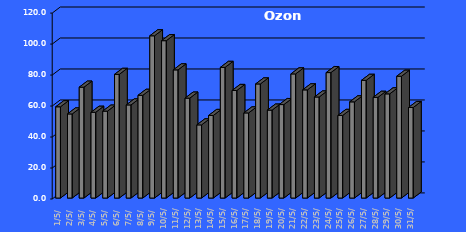
| Category | Ozon  [µg/m3] |
|---|---|
| 2023-05-01 | 58.909 |
| 2023-05-02 | 54.284 |
| 2023-05-03 | 71.57 |
| 2023-05-04 | 55.371 |
| 2023-05-05 | 56.107 |
| 2023-05-06 | 79.833 |
| 2023-05-07 | 60.107 |
| 2023-05-08 | 66.31 |
| 2023-05-09 | 104.729 |
| 2023-05-10 | 101.578 |
| 2023-05-11 | 82.733 |
| 2023-05-12 | 64.502 |
| 2023-05-13 | 47.219 |
| 2023-05-14 | 53.305 |
| 2023-05-15 | 84.342 |
| 2023-05-16 | 69.433 |
| 2023-05-17 | 54.95 |
| 2023-05-18 | 73.649 |
| 2023-05-19 | 56.762 |
| 2023-05-20 | 60.337 |
| 2023-05-21 | 80.129 |
| 2023-05-22 | 69.826 |
| 2023-05-23 | 65.223 |
| 2023-05-24 | 80.973 |
| 2023-05-25 | 53.337 |
| 2023-05-26 | 62.093 |
| 2023-05-27 | 75.981 |
| 2023-05-28 | 65.019 |
| 2023-05-29 | 67.243 |
| 2023-05-30 | 78.633 |
| 2023-05-31 | 58.444 |